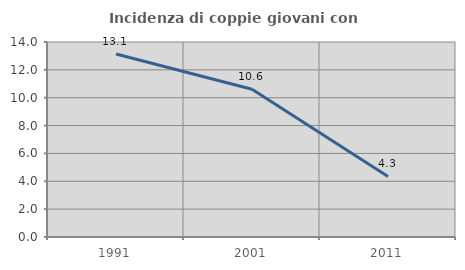
| Category | Incidenza di coppie giovani con figli |
|---|---|
| 1991.0 | 13.139 |
| 2001.0 | 10.606 |
| 2011.0 | 4.348 |